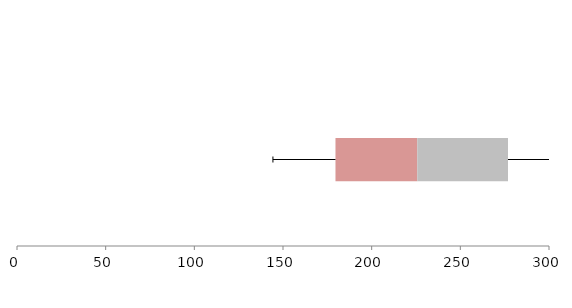
| Category | Series 1 | Series 2 | Series 3 |
|---|---|---|---|
| 0 | 179.595 | 46.125 | 51.158 |